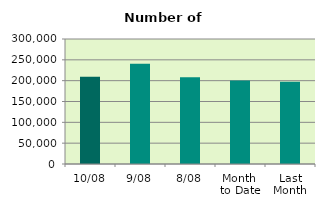
| Category | Series 0 |
|---|---|
| 10/08 | 209264 |
| 9/08 | 240834 |
| 8/08 | 208244 |
| Month 
to Date | 200579 |
| Last
Month | 197154.286 |